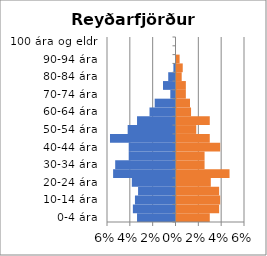
| Category | % karlar | %konur |
|---|---|---|
| 0-4 ára | -0.034 | 0.029 |
| 5-9 ára | -0.037 | 0.037 |
| 10-14 ára | -0.036 | 0.038 |
| 15-19 ára | -0.033 | 0.037 |
| 20-24 ára | -0.038 | 0.03 |
| 25-29 ára | -0.055 | 0.046 |
| 30-34 ára | -0.053 | 0.025 |
| 35-39 ára | -0.041 | 0.025 |
| 40-44 ára | -0.041 | 0.038 |
| 45-49 ára | -0.057 | 0.029 |
| 50-54 ára | -0.042 | 0.017 |
| 55-59 ára | -0.034 | 0.029 |
| 60-64 ára | -0.023 | 0.013 |
| 65-69 ára | -0.018 | 0.012 |
| 70-74 ára | -0.005 | 0.008 |
| 75-79 ára | -0.011 | 0.008 |
| 80-84 ára | -0.006 | 0.005 |
| 85-89 ára | -0.002 | 0.005 |
| 90-94 ára | 0 | 0.003 |
| 95-99 ára | 0 | 0 |
| 100 ára og eldri | 0 | 0 |